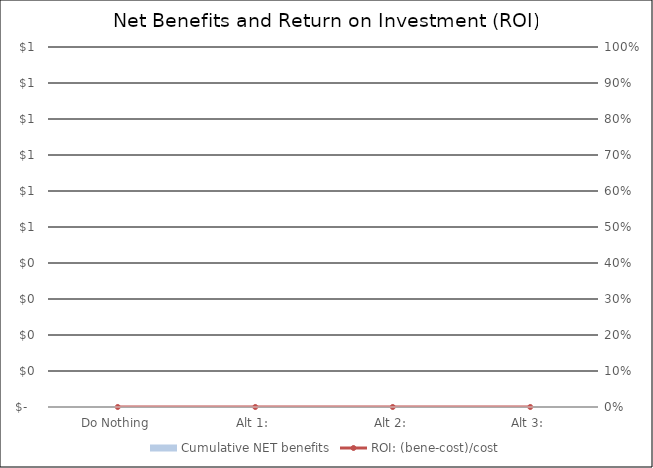
| Category | Cumulative NET benefits |
|---|---|
|  Do Nothing  | 0 |
|  Alt 1:  | 0 |
|  Alt 2:  | 0 |
|  Alt 3:  | 0 |